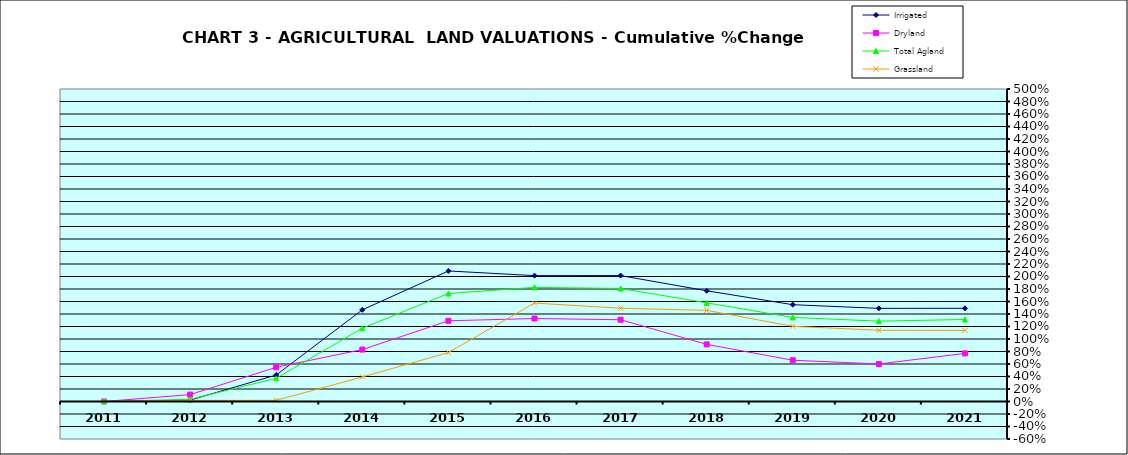
| Category | Irrigated | Dryland | Total Agland | Grassland |
|---|---|---|---|---|
| 2011.0 | 0 | 0 | 0 | 0 |
| 2012.0 | 0.022 | 0.11 | 0.036 | 0.018 |
| 2013.0 | 0.424 | 0.547 | 0.371 | 0.019 |
| 2014.0 | 1.467 | 0.831 | 1.173 | 0.392 |
| 2015.0 | 2.089 | 1.291 | 1.728 | 0.783 |
| 2016.0 | 2.014 | 1.328 | 1.826 | 1.575 |
| 2017.0 | 2.015 | 1.308 | 1.809 | 1.492 |
| 2018.0 | 1.772 | 0.914 | 1.579 | 1.458 |
| 2019.0 | 1.549 | 0.66 | 1.345 | 1.203 |
| 2020.0 | 1.49 | 0.6 | 1.286 | 1.14 |
| 2021.0 | 1.491 | 0.77 | 1.313 | 1.136 |